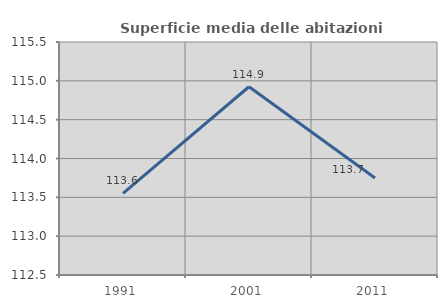
| Category | Superficie media delle abitazioni occupate |
|---|---|
| 1991.0 | 113.551 |
| 2001.0 | 114.924 |
| 2011.0 | 113.75 |